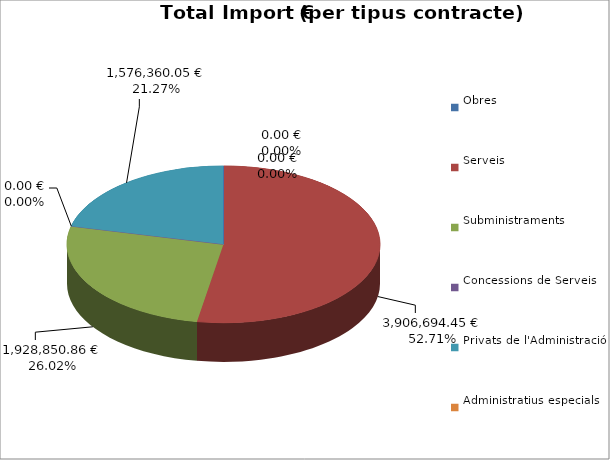
| Category | Total preu
(amb IVA) |
|---|---|
| Obres | 0 |
| Serveis | 3906694.45 |
| Subministraments | 1928850.86 |
| Concessions de Serveis | 0 |
| Privats de l'Administració | 1576360.05 |
| Administratius especials | 0 |